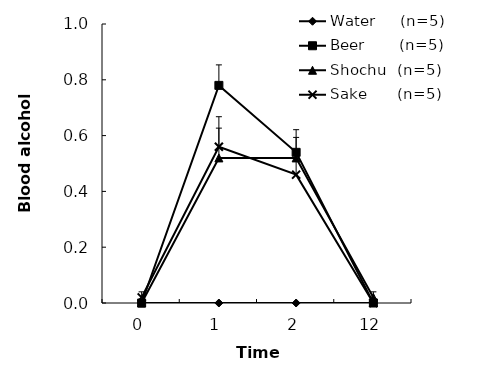
| Category | Water     (n=5) | Beer       (n=5) | Shochu  (n=5) | Sake      (n=5) |
|---|---|---|---|---|
| 0.0 | 0 | 0 | 0 | 0.02 |
| 1.0 | 0 | 0.78 | 0.52 | 0.56 |
| 2.0 | 0 | 0.54 | 0.52 | 0.46 |
| 12.0 | 0 | 0 | 0.02 | 0 |